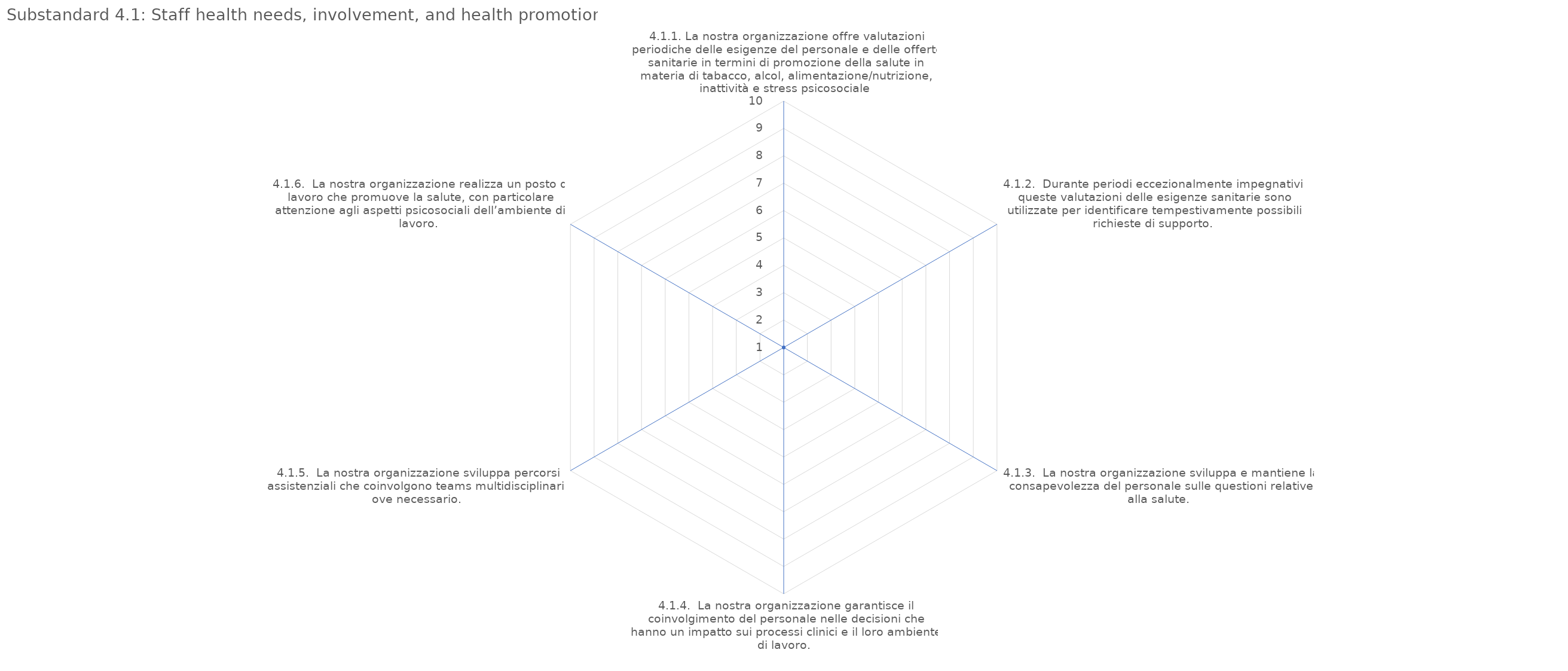
| Category | value |
|---|---|
| 4.1.1. La nostra organizzazione offre valutazioni periodiche delle esigenze del personale e delle offerte sanitarie in termini di promozione della salute in materia di tabacco, alcol, alimentazione/nutrizione, inattività e stress psicosociale | 1 |
| 4.1.2.  Durante periodi eccezionalmente impegnativi, queste valutazioni delle esigenze sanitarie sono utilizzate per identificare tempestivamente possibili richieste di supporto. | 1 |
| 4.1.3.  La nostra organizzazione sviluppa e mantiene la consapevolezza del personale sulle questioni relative alla salute. | 1 |
| 4.1.4.  La nostra organizzazione garantisce il coinvolgimento del personale nelle decisioni che hanno un impatto sui processi clinici e il loro ambiente di lavoro. | 1 |
| 4.1.5.  La nostra organizzazione sviluppa percorsi assistenziali che coinvolgono teams multidisciplinari, ove necessario. | 1 |
| 4.1.6.  La nostra organizzazione realizza un posto di lavoro che promuove la salute, con particolare attenzione agli aspetti psicosociali dell’ambiente di lavoro. | 1 |